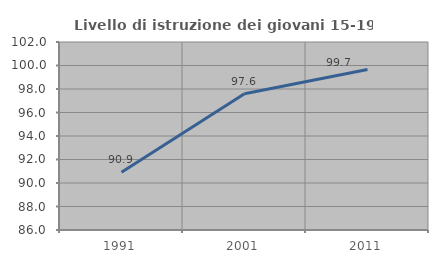
| Category | Livello di istruzione dei giovani 15-19 anni |
|---|---|
| 1991.0 | 90.909 |
| 2001.0 | 97.6 |
| 2011.0 | 99.653 |